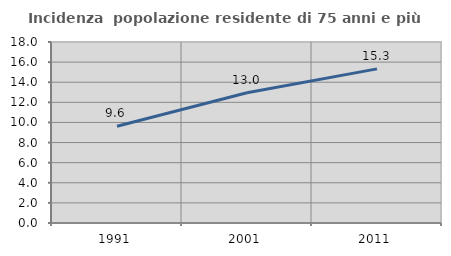
| Category | Incidenza  popolazione residente di 75 anni e più |
|---|---|
| 1991.0 | 9.621 |
| 2001.0 | 12.954 |
| 2011.0 | 15.33 |